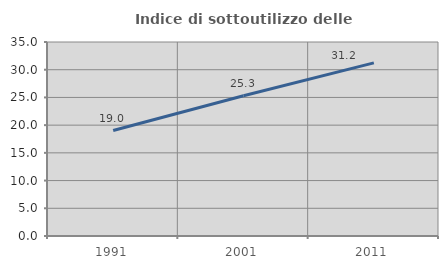
| Category | Indice di sottoutilizzo delle abitazioni  |
|---|---|
| 1991.0 | 19.021 |
| 2001.0 | 25.299 |
| 2011.0 | 31.229 |